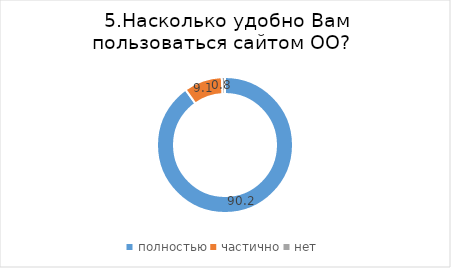
| Category | Series 0 |
|---|---|
| полностью | 90.152 |
| частично | 9.091 |
| нет | 0.758 |